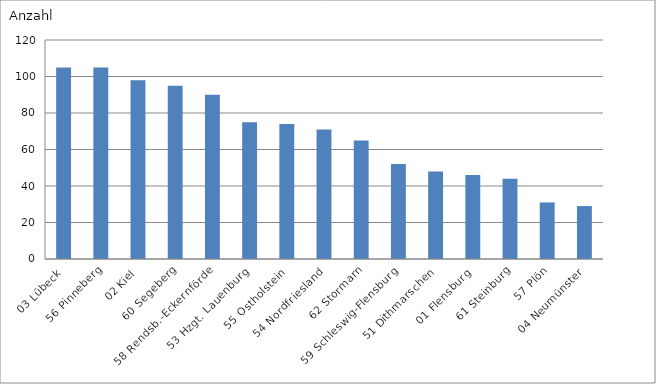
| Category | 03 Lübeck |
|---|---|
| 03 Lübeck | 105 |
| 56 Pinneberg | 105 |
| 02 Kiel | 98 |
| 60 Segeberg | 95 |
| 58 Rendsb.-Eckernförde | 90 |
| 53 Hzgt. Lauenburg | 75 |
| 55 Ostholstein | 74 |
| 54 Nordfriesland | 71 |
| 62 Stormarn | 65 |
| 59 Schleswig-Flensburg | 52 |
| 51 Dithmarschen | 48 |
| 01 Flensburg | 46 |
| 61 Steinburg | 44 |
| 57 Plön | 31 |
| 04 Neumünster | 29 |